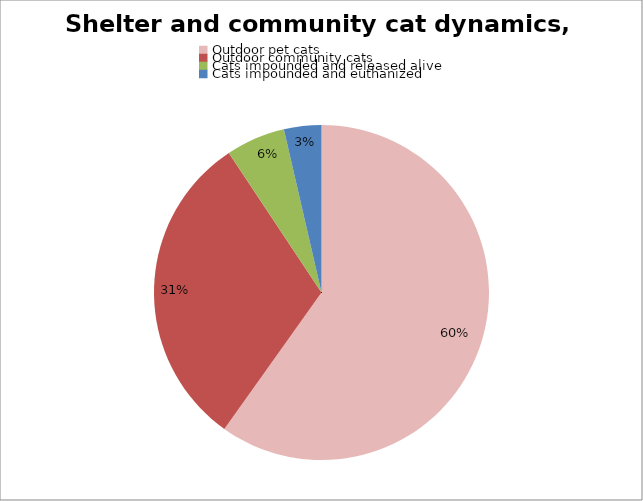
| Category | Series 0 |
|---|---|
| Outdoor pet cats | 4080000 |
| Outdoor community cats | 2101204.819 |
| Cats impounded and released alive | 390000 |
| Cats impounded and euthanized | 246000 |